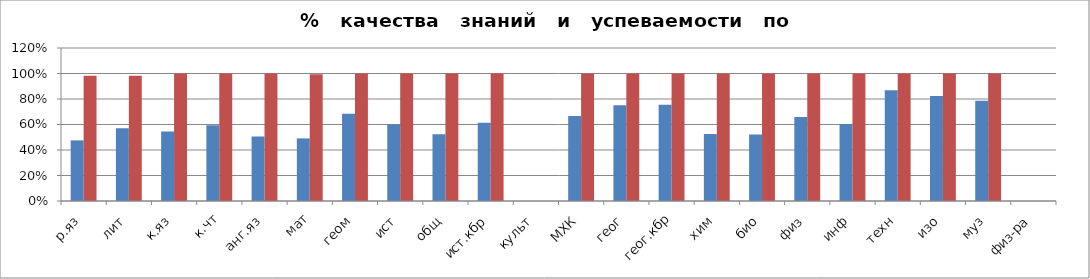
| Category | Series 0 | 2 |
|---|---|---|
| р.яз | 0.476 | 0.982 |
| лит | 0.571 | 0.982 |
| к.яз | 0.545 | 1 |
| к.чт | 0.594 | 1 |
| анг.яз | 0.506 | 1 |
| мат | 0.491 | 0.994 |
| геом | 0.684 | 1 |
| ист | 0.6 | 1 |
| общ | 0.523 | 1 |
| ист.кбр | 0.614 | 1 |
| культ | 0 | 0 |
| МХК | 0.667 | 1 |
| геог | 0.752 | 1 |
| геог.кбр | 0.754 | 1 |
| хим | 0.526 | 1 |
| био | 0.521 | 1 |
| физ | 0.659 | 1 |
| инф | 0.604 | 1 |
| техн | 0.868 | 1 |
| изо | 0.824 | 1 |
| муз | 0.787 | 1 |
| физ-ра | 0 | 0 |